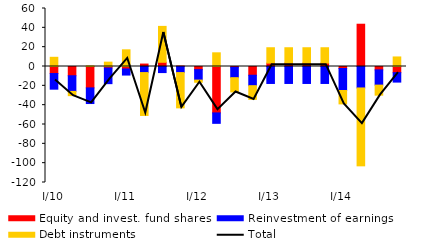
| Category | Equity and invest. fund shares | Reinvestment of earnings | Debt instruments |
|---|---|---|---|
| I/10 | -7.275 | -16.177 | 9.518 |
| II | -9.577 | -16.177 | -4.411 |
| III | -22.133 | -16.177 | 0.669 |
| IV | -1.568 | -16.177 | 4.495 |
| I/11 | -2.569 | -6.291 | 17.255 |
| II | 2.527 | -6.291 | -44.364 |
| III | 4.362 | -6.291 | 37.132 |
| IV | 0.507 | -6.291 | -36.489 |
| I/12 | -3.253 | -10.785 | -2.251 |
| II | -48.016 | -10.785 | 14.16 |
| III | -0.777 | -10.785 | -14.771 |
| IV | -9.051 | -10.785 | -14.161 |
| I/13 | 3.515 | -17.551 | 15.896 |
| II | 3.515 | -17.551 | 15.896 |
| III | 3.515 | -17.551 | 15.896 |
| IV | 3.515 | -17.551 | 15.896 |
| I/14 | -2.088 | -22.755 | -13.843 |
| II | 43.736 | -22.199 | -80.565 |
| III | -3.51 | -15.748 | -10.404 |
| IV | -6.372 | -9.765 | 9.879 |